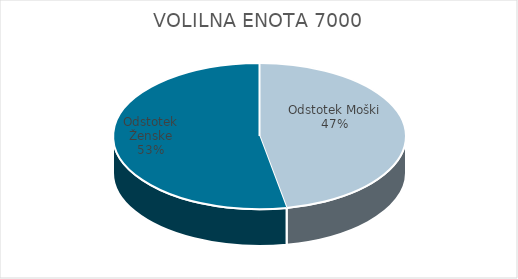
| Category | VOLILNA ENOTA 7000 | #REF! | Slovenija skupaj |
|---|---|---|---|
| Odstotek Moški | 22.2 |  | 24.13 |
| Odstotek Ženske | 24.99 |  | 27.06 |